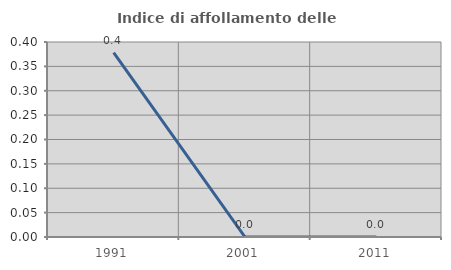
| Category | Indice di affollamento delle abitazioni  |
|---|---|
| 1991.0 | 0.378 |
| 2001.0 | 0 |
| 2011.0 | 0 |